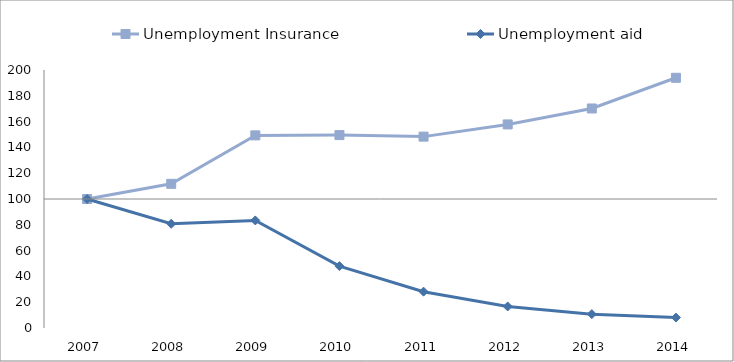
| Category | Unemployment Insurance | Unemployment aid | 0 |
|---|---|---|---|
| 2007.0 | 100 | 100 |  |
| 2008.0 | 111.772 | 80.783 |  |
| 2009.0 | 149.31 | 83.384 |  |
| 2010.0 | 149.545 | 47.966 |  |
| 2011.0 | 148.355 | 28.156 |  |
| 2012.0 | 157.802 | 16.696 |  |
| 2013.0 | 170.173 | 10.752 |  |
| 2014.0 | 193.966 | 8.1 |  |